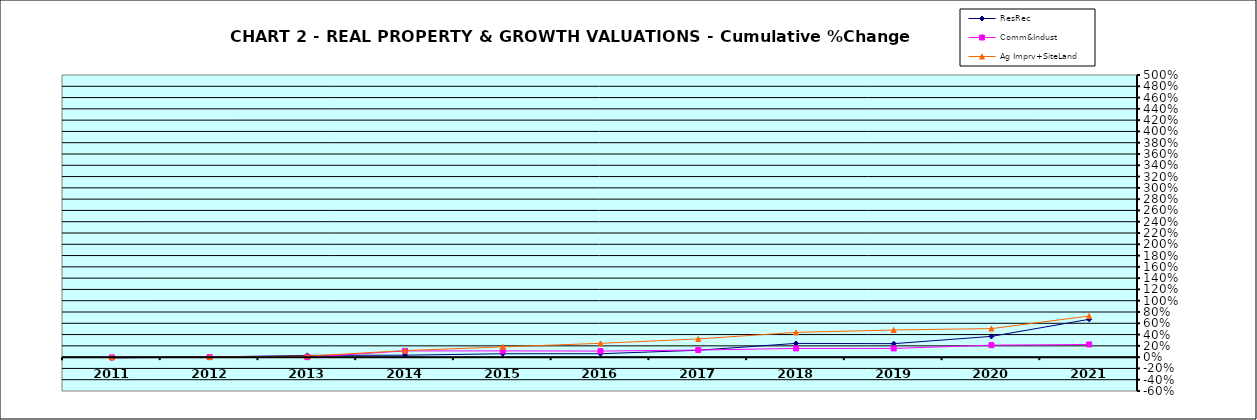
| Category | ResRec | Comm&Indust | Ag Imprv+SiteLand |
|---|---|---|---|
| 2011.0 | -0.013 | -0.004 | 0 |
| 2012.0 | 0.002 | 0 | 0.002 |
| 2013.0 | 0.032 | -0.001 | 0.018 |
| 2014.0 | 0.034 | 0.11 | 0.116 |
| 2015.0 | 0.06 | 0.111 | 0.182 |
| 2016.0 | 0.061 | 0.108 | 0.245 |
| 2017.0 | 0.122 | 0.126 | 0.323 |
| 2018.0 | 0.243 | 0.155 | 0.438 |
| 2019.0 | 0.239 | 0.155 | 0.482 |
| 2020.0 | 0.368 | 0.213 | 0.506 |
| 2021.0 | 0.67 | 0.225 | 0.729 |